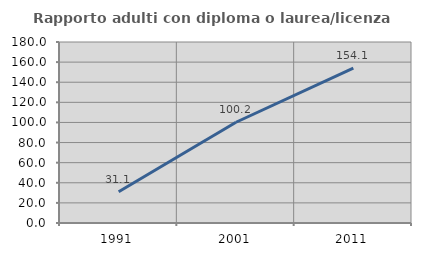
| Category | Rapporto adulti con diploma o laurea/licenza media  |
|---|---|
| 1991.0 | 31.111 |
| 2001.0 | 100.195 |
| 2011.0 | 154.054 |